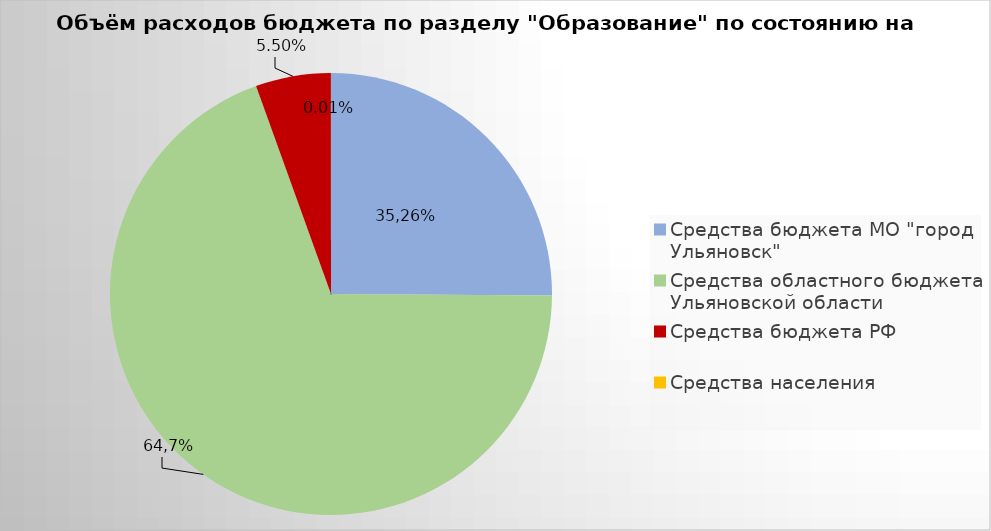
| Category | Series 0 |
|---|---|
| Средства бюджета МО "город Ульяновск" | 2199995.18 |
| Средства областного бюджета Ульяновской области | 6078742.37 |
| Средства бюджета РФ | 481889.6 |
| Средства населения | 558.01 |